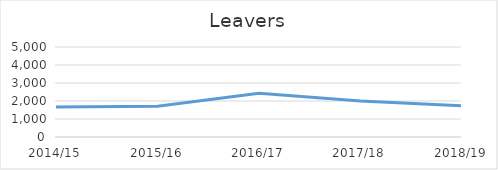
| Category | Leavers |
|---|---|
| 2014/15 | 1664 |
| 2015/16 | 1710 |
| 2016/17 | 2426 |
| 2017/18 | 2002 |
| 2018/19 | 1730 |